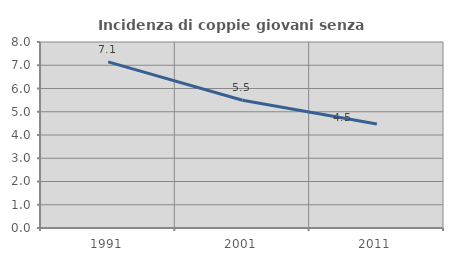
| Category | Incidenza di coppie giovani senza figli |
|---|---|
| 1991.0 | 7.147 |
| 2001.0 | 5.492 |
| 2011.0 | 4.473 |